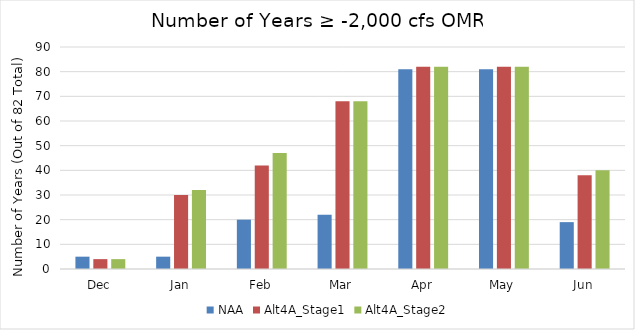
| Category | NAA | Alt4A_Stage1 | Alt4A_Stage2 |
|---|---|---|---|
| Dec | 5 | 4 | 4 |
| Jan | 5 | 30 | 32 |
| Feb | 20 | 42 | 47 |
| Mar | 22 | 68 | 68 |
| Apr | 81 | 82 | 82 |
| May | 81 | 82 | 82 |
| Jun | 19 | 38 | 40 |